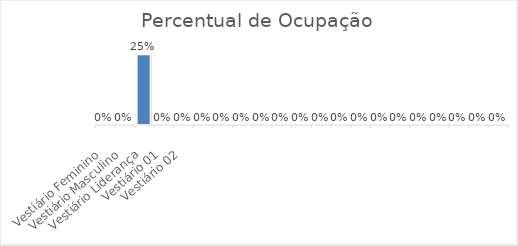
| Category | Percentual de Ocupação |
|---|---|
| Vestiário Feminino | 0 |
| Vestiário Masculino | 0 |
| Vestiário Liderança | 0.25 |
| Vestiário 01 | 0 |
| Vestiário 02 | 0 |